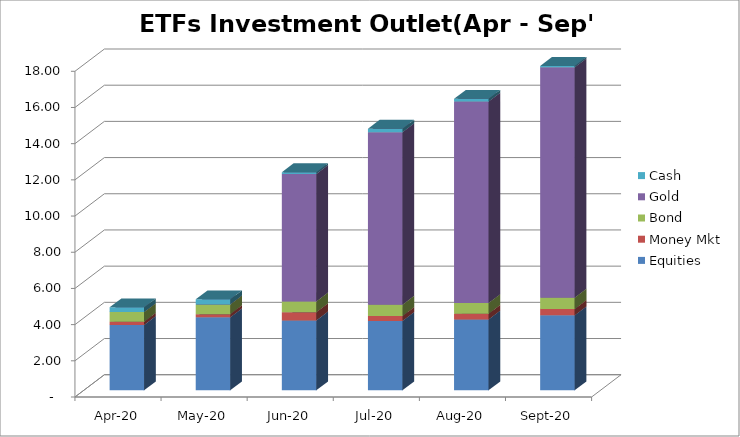
| Category | Equities | Money Mkt | Bond | Gold | Cash |
|---|---|---|---|---|---|
| 2020-04-01 | 3614392230.14 | 175752553.41 | 535087967.52 | 0 | 260113227.03 |
| 2020-05-01 | 4032265012.12 | 177070409.49 | 538903891.86 | 0 | 278503239.37 |
| 2020-06-01 | 3864587279.22 | 452492408.13 | 591048061.03 | 7051738147.24 | 93622092.4 |
| 2020-07-01 | 3831828644.68 | 272103487.34 | 625862830.11 | 9533055643.75 | 191169576.23 |
| 2020-08-01 | 3913723749.54 | 316071867.88 | 592621089.37 | 11135395115.33 | 152002086.71 |
| 2020-09-01 | 4141425949.9 | 349803623.89 | 626583310.45 | 12731001529.98 | 76107936.49 |